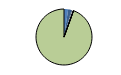
| Category | Series 0 |
|---|---|
| ARRASTRE | 66 |
| CERCO | 52 |
| ATUNEROS CAÑEROS | 14 |
| PALANGRE DE FONDO | 14 |
| PALANGRE DE SUPERFICIE | 3 |
| RASCO | 1 |
| VOLANTA | 1 |
| ARTES FIJAS | 2 |
| ARTES MENORES | 2602 |